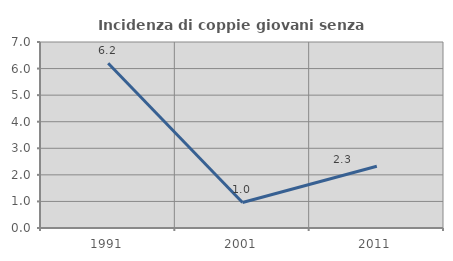
| Category | Incidenza di coppie giovani senza figli |
|---|---|
| 1991.0 | 6.202 |
| 2001.0 | 0.962 |
| 2011.0 | 2.326 |